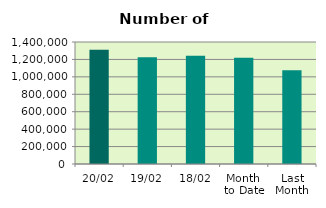
| Category | Series 0 |
|---|---|
| 20/02 | 1312334 |
| 19/02 | 1225270 |
| 18/02 | 1241440 |
| Month 
to Date | 1220223.571 |
| Last
Month | 1075899.909 |